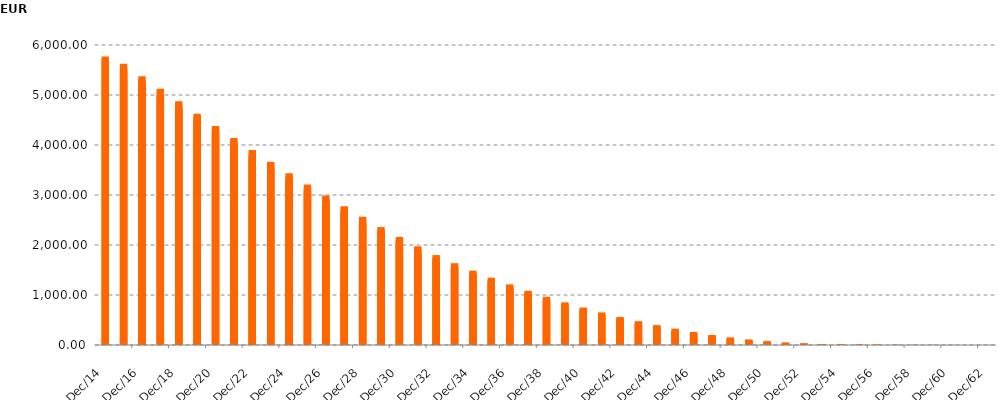
| Category | Series 1 |
|---|---|
| 2014-09-30 | 5772212339.22 |
| 2014-12-31 | 5686038754.48 |
| 2015-03-31 | 5623503382.04 |
| 2015-06-30 | 5560983117.68 |
| 2015-09-30 | 5498462876.75 |
| 2015-12-31 | 5435926602.36 |
| 2016-03-31 | 5373429489.71 |
| 2016-06-30 | 5310950972.43 |
| 2016-09-30 | 5248483432.24 |
| 2016-12-31 | 5186025494.44 |
| 2017-03-31 | 5123657814.32 |
| 2017-06-30 | 5061376386.94 |
| 2017-09-30 | 4999115946.49 |
| 2017-12-31 | 4936883743.12 |
| 2018-03-31 | 4874700542.76 |
| 2018-06-30 | 4812586589.81 |
| 2018-09-30 | 4750591786.97 |
| 2018-12-31 | 4688746049.28 |
| 2019-03-31 | 4627027679.43 |
| 2019-06-30 | 4565464429.61 |
| 2019-09-30 | 4504095700.6 |
| 2019-12-31 | 4442894626.14 |
| 2020-03-31 | 4381845284.77 |
| 2020-06-30 | 4321004636.39 |
| 2020-09-30 | 4260340196 |
| 2020-12-31 | 4199872837.25 |
| 2021-03-31 | 4139572320.24 |
| 2021-06-30 | 4079421371.05 |
| 2021-09-30 | 4019480352.96 |
| 2021-12-31 | 3959715235.88 |
| 2022-03-31 | 3900132225.66 |
| 2022-06-30 | 3840814403.1 |
| 2022-09-30 | 3781783586.18 |
| 2022-12-31 | 3723053627.91 |
| 2023-03-31 | 3664603971.79 |
| 2023-06-30 | 3606467011.1 |
| 2023-09-30 | 3548599702.97 |
| 2023-12-31 | 3491099154.14 |
| 2024-03-31 | 3433899132.92 |
| 2024-06-30 | 3377033970.32 |
| 2024-09-30 | 3320455541.82 |
| 2024-12-31 | 3264240699.81 |
| 2025-03-31 | 3208359506.92 |
| 2025-06-30 | 3152817589.1 |
| 2025-09-30 | 3097641357.73 |
| 2025-12-31 | 3042815307.63 |
| 2026-03-31 | 2988287861.82 |
| 2026-06-30 | 2934056759.11 |
| 2026-09-30 | 2880091888.98 |
| 2026-12-31 | 2826455108.93 |
| 2027-03-31 | 2773137663.33 |
| 2027-06-30 | 2720087054.57 |
| 2027-09-30 | 2667370231.27 |
| 2027-12-31 | 2614993553.47 |
| 2028-03-31 | 2562998633.79 |
| 2028-06-30 | 2511308228.64 |
| 2028-09-30 | 2460006999.93 |
| 2028-12-31 | 2409282841.89 |
| 2029-03-31 | 2359004508.7 |
| 2029-06-30 | 2309150500.24 |
| 2029-09-30 | 2259744567.81 |
| 2029-12-31 | 2210863424.8 |
| 2030-03-31 | 2162384158.19 |
| 2030-06-30 | 2114477079.2 |
| 2030-09-30 | 2067141764.39 |
| 2030-12-31 | 2020478893.39 |
| 2031-03-31 | 1974492118.88 |
| 2031-06-30 | 1929279767.32 |
| 2031-09-30 | 1884864890.38 |
| 2031-12-31 | 1841303224.7 |
| 2032-03-31 | 1798498013.95 |
| 2032-06-30 | 1756366310.58 |
| 2032-09-30 | 1715077040.72 |
| 2032-12-31 | 1674997678.44 |
| 2033-03-31 | 1636180917.31 |
| 2033-06-30 | 1598069780.06 |
| 2033-09-30 | 1560538208.21 |
| 2033-12-31 | 1523657394.66 |
| 2034-03-31 | 1487339498.89 |
| 2034-06-30 | 1451550494.65 |
| 2034-09-30 | 1416230108.23 |
| 2034-12-31 | 1381344792.11 |
| 2035-03-31 | 1346839583.26 |
| 2035-06-30 | 1312726708.13 |
| 2035-09-30 | 1278990673.82 |
| 2035-12-31 | 1245711202.41 |
| 2036-03-31 | 1212799576.76 |
| 2036-06-30 | 1180287666.54 |
| 2036-09-30 | 1148197026.65 |
| 2036-12-31 | 1116562917.44 |
| 2037-03-31 | 1085325286.9 |
| 2037-06-30 | 1054491429.51 |
| 2037-09-30 | 1024112668.5 |
| 2037-12-31 | 994269562.25 |
| 2038-03-31 | 964932042.04 |
| 2038-06-30 | 936133441.79 |
| 2038-09-30 | 907914874.27 |
| 2038-12-31 | 880284367.45 |
| 2039-03-31 | 853141191.17 |
| 2039-06-30 | 826451640.89 |
| 2039-09-30 | 800231001.67 |
| 2039-12-31 | 774496122.01 |
| 2040-03-31 | 749130780.38 |
| 2040-06-30 | 724192801.32 |
| 2040-09-30 | 699667317.7 |
| 2040-12-31 | 675623771.71 |
| 2041-03-31 | 651925427.11 |
| 2041-06-30 | 628604485.54 |
| 2041-09-30 | 605658994.1 |
| 2041-12-31 | 583126287.75 |
| 2042-03-31 | 560930198.58 |
| 2042-06-30 | 539093927.45 |
| 2042-09-30 | 517641416.55 |
| 2042-12-31 | 496638627.98 |
| 2043-03-31 | 475997131.62 |
| 2043-06-30 | 455784064.4 |
| 2043-09-30 | 436010215.72 |
| 2043-12-31 | 416726212.28 |
| 2044-03-31 | 397820747.68 |
| 2044-06-30 | 379362963.95 |
| 2044-09-30 | 361304819.38 |
| 2044-12-31 | 343668158.58 |
| 2045-03-31 | 326372853.64 |
| 2045-06-30 | 309410095.33 |
| 2045-09-30 | 292788651.52 |
| 2045-12-31 | 276597325.57 |
| 2046-03-31 | 260780823.66 |
| 2046-06-30 | 245399243.56 |
| 2046-09-30 | 230487845.32 |
| 2046-12-31 | 216107756.31 |
| 2047-03-31 | 202239817.82 |
| 2047-06-30 | 188882735.61 |
| 2047-09-30 | 176090091.91 |
| 2047-12-31 | 163945002.82 |
| 2048-03-31 | 152302061.27 |
| 2048-06-30 | 141216501.38 |
| 2048-09-30 | 130648656.24 |
| 2048-12-31 | 120629931.93 |
| 2049-03-31 | 110974879.26 |
| 2049-06-30 | 101674606.53 |
| 2049-09-30 | 92819551.62 |
| 2049-12-31 | 84444205.17 |
| 2050-03-31 | 76537876.76 |
| 2050-06-30 | 69155884.53 |
| 2050-09-30 | 62318308.6 |
| 2050-12-31 | 56139007.52 |
| 2051-03-31 | 50541547.58 |
| 2051-06-30 | 45499368.15 |
| 2051-09-30 | 40884775.24 |
| 2051-12-31 | 36627008 |
| 2052-03-31 | 32661177.39 |
| 2052-06-30 | 29058718.24 |
| 2052-09-30 | 25781648.72 |
| 2052-12-31 | 22899185.79 |
| 2053-03-31 | 20390523.21 |
| 2053-06-30 | 18223604.5 |
| 2053-09-30 | 16384246.95 |
| 2053-12-31 | 14833866.82 |
| 2054-03-31 | 13502236.86 |
| 2054-06-30 | 12412159.5 |
| 2054-09-30 | 11533747.26 |
| 2054-12-31 | 10718136.58 |
| 2055-03-31 | 9937122.08 |
| 2055-06-30 | 9182379.97 |
| 2055-09-30 | 8465901.77 |
| 2055-12-31 | 7775777.75 |
| 2056-03-31 | 7115240.48 |
| 2056-06-30 | 6493783.22 |
| 2056-09-30 | 5921278.88 |
| 2056-12-31 | 5373815.33 |
| 2057-03-31 | 4870376.51 |
| 2057-06-30 | 4398519.01 |
| 2057-09-30 | 3952225.7 |
| 2057-12-31 | 3547265.27 |
| 2058-03-31 | 3171218.15 |
| 2058-06-30 | 2834362.6 |
| 2058-09-30 | 2524589.03 |
| 2058-12-31 | 2235030.41 |
| 2059-03-31 | 1966594.72 |
| 2059-06-30 | 1727652.7 |
| 2059-09-30 | 1508604.23 |
| 2059-12-31 | 1308364.11 |
| 2060-03-31 | 1124016.74 |
| 2060-06-30 | 957145.67 |
| 2060-09-30 | 807168.43 |
| 2060-12-31 | 675189.87 |
| 2061-03-31 | 553179.3 |
| 2061-06-30 | 449420.75 |
| 2061-09-30 | 367662.71 |
| 2061-12-31 | 304478.79 |
| 2062-03-31 | 247467.21 |
| 2062-06-30 | 193998.03 |
| 2062-09-30 | 152023.89 |
| 2062-12-31 | 112747.81 |
| 2063-03-31 | 77435.65 |
| 2063-06-30 | 50411.44 |
| 2063-09-30 | 29836.3 |
| 2063-12-31 | 15007.02 |
| 2064-03-31 | 5351.1 |
| 2064-06-30 | 492.35 |